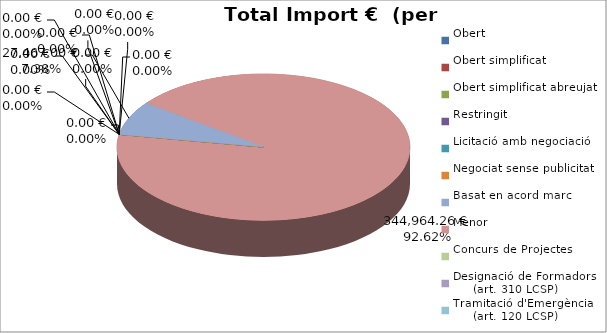
| Category | Total preu
(amb IVA) |
|---|---|
| Obert | 0 |
| Obert simplificat | 0 |
| Obert simplificat abreujat | 0 |
| Restringit | 0 |
| Licitació amb negociació | 0 |
| Negociat sense publicitat | 0 |
| Basat en acord marc | 27467 |
| Menor | 344964.26 |
| Concurs de Projectes | 0 |
| Designació de Formadors
     (art. 310 LCSP) | 0 |
| Tramitació d'Emergència
     (art. 120 LCSP) | 0 |